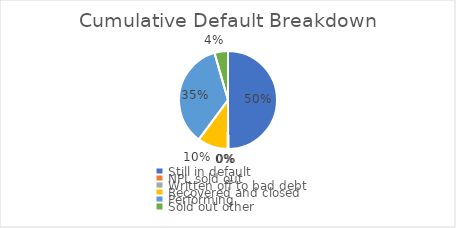
| Category | Series 0 |
|---|---|
| Still in default | 0.499 |
| NPL sold out | 0 |
| Written off to bad debt | 0.001 |
| Recovered and closed | 0.101 |
| Performing | 0.354 |
| Sold out other | 0.045 |